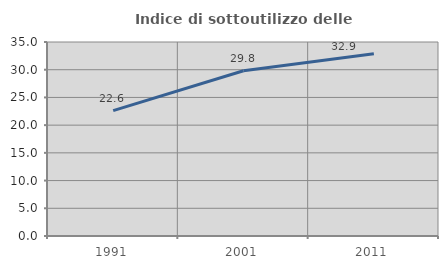
| Category | Indice di sottoutilizzo delle abitazioni  |
|---|---|
| 1991.0 | 22.615 |
| 2001.0 | 29.806 |
| 2011.0 | 32.894 |